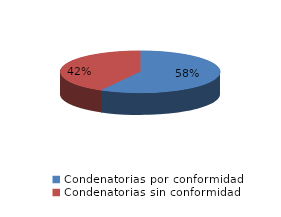
| Category | Series 0 |
|---|---|
| 0 | 734 |
| 1 | 530 |